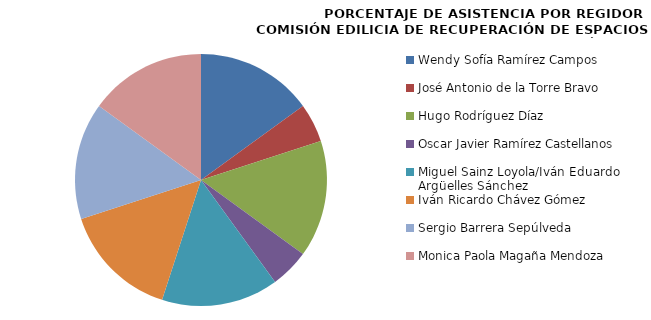
| Category | Series 0 |
|---|---|
| Wendy Sofía Ramírez Campos | 100 |
| José Antonio de la Torre Bravo | 33.333 |
| Hugo Rodríguez Díaz | 100 |
| Oscar Javier Ramírez Castellanos | 33.333 |
| Miguel Sainz Loyola/Iván Eduardo Argüelles Sánchez | 100 |
| Iván Ricardo Chávez Gómez | 100 |
| Sergio Barrera Sepúlveda | 100 |
| Monica Paola Magaña Mendoza | 100 |